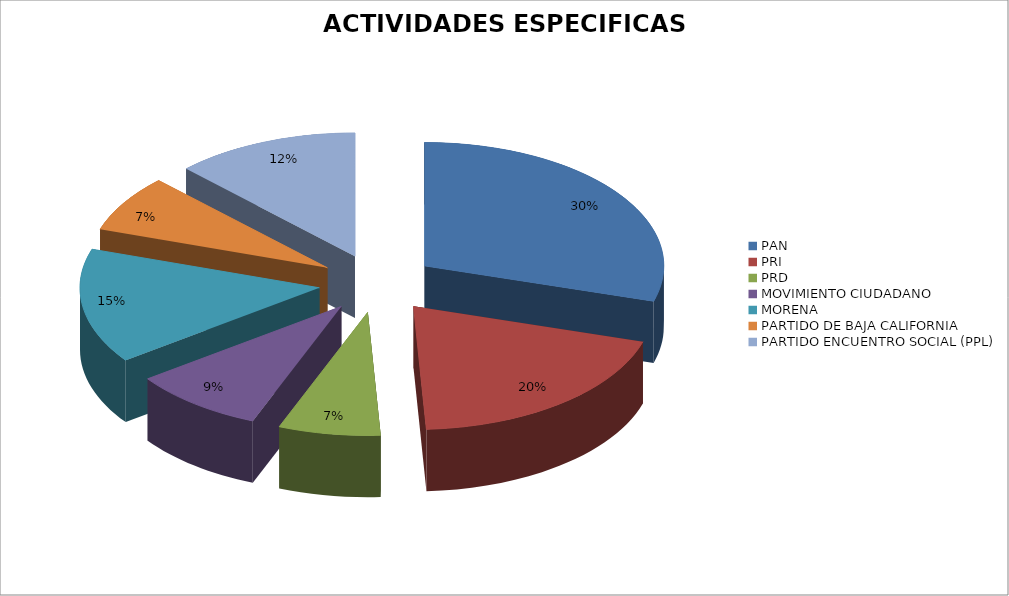
| Category | Series 0 |
|---|---|
| PAN | 1042771.26 |
| PRI | 686407.28 |
| PRD | 242312.07 |
| MOVIMIENTO CIUDADANO | 315586.42 |
| MORENA | 530314.93 |
| PARTIDO DE BAJA CALIFORNIA | 262965.8 |
| PARTIDO ENCUENTRO SOCIAL (PPL) | 438283.25 |